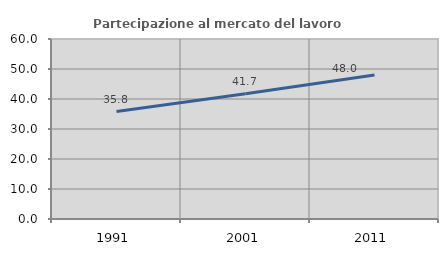
| Category | Partecipazione al mercato del lavoro  femminile |
|---|---|
| 1991.0 | 35.798 |
| 2001.0 | 41.736 |
| 2011.0 | 48 |